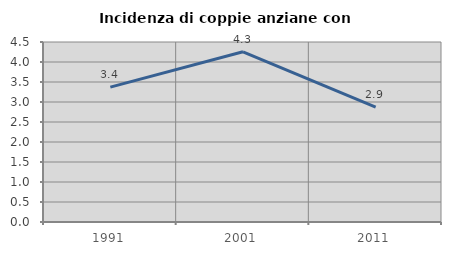
| Category | Incidenza di coppie anziane con figli |
|---|---|
| 1991.0 | 3.371 |
| 2001.0 | 4.255 |
| 2011.0 | 2.871 |